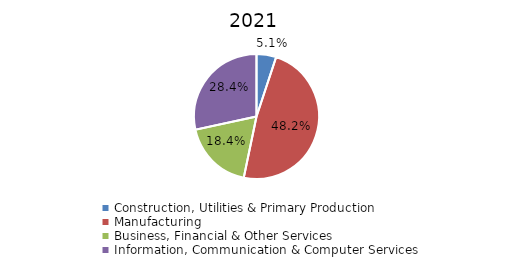
| Category | 2021 |
|---|---|
| Construction, Utilities & Primary Production  | 0.051 |
| Manufacturing  | 0.482 |
| Business, Financial & Other Services | 0.184 |
| Information, Communication & Computer Services | 0.284 |